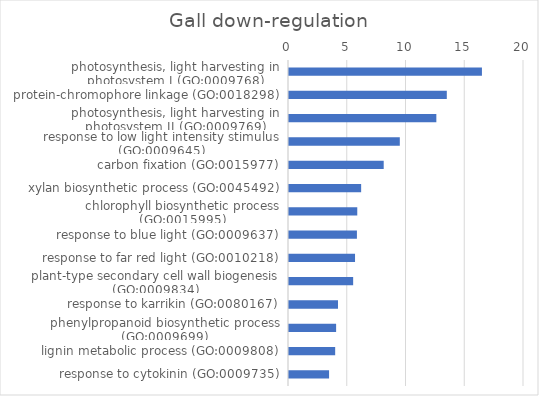
| Category | Series 0 |
|---|---|
| photosynthesis, light harvesting in photosystem I (GO:0009768) | 16.42 |
| protein-chromophore linkage (GO:0018298) | 13.43 |
| photosynthesis, light harvesting in photosystem II (GO:0009769) | 12.54 |
| response to low light intensity stimulus (GO:0009645) | 9.43 |
| carbon fixation (GO:0015977) | 8.06 |
| xylan biosynthetic process (GO:0045492) | 6.14 |
| chlorophyll biosynthetic process (GO:0015995) | 5.81 |
| response to blue light (GO:0009637) | 5.78 |
| response to far red light (GO:0010218) | 5.62 |
| plant-type secondary cell wall biogenesis (GO:0009834) | 5.46 |
| response to karrikin (GO:0080167) | 4.17 |
| phenylpropanoid biosynthetic process (GO:0009699) | 4.01 |
| lignin metabolic process (GO:0009808) | 3.93 |
| response to cytokinin (GO:0009735) | 3.41 |